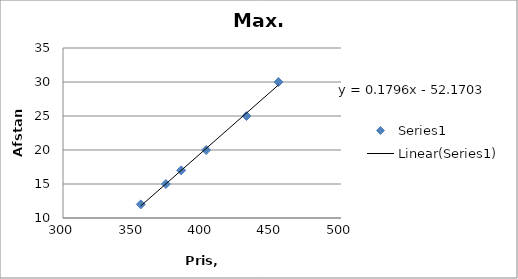
| Category | Series 0 |
|---|---|
| 356.0 | 12 |
| 374.0 | 15 |
| 385.0 | 17 |
| 403.0 | 20 |
| 432.0 | 25 |
| 455.0 | 30 |